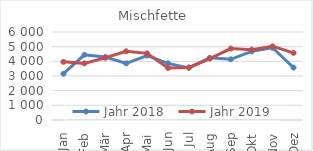
| Category | Jahr 2018 | Jahr 2019 |
|---|---|---|
| Jan | 3155 | 3966 |
| Feb | 4447 | 3858 |
| Mär | 4296 | 4241 |
| Apr | 3862 | 4686 |
| Mai | 4393 | 4544 |
| Jun | 3861 | 3548 |
| Jul | 3552 | 3585 |
| Aug | 4241 | 4188 |
| Sep | 4139 | 4871 |
| Okt | 4678 | 4796 |
| Nov | 4926 | 5023 |
| Dez | 3573 | 4576 |